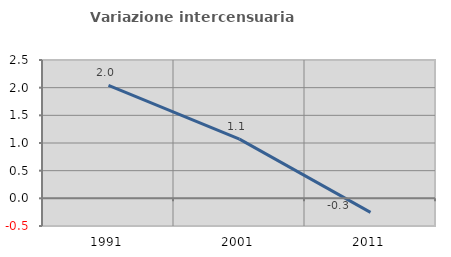
| Category | Variazione intercensuaria annua |
|---|---|
| 1991.0 | 2.042 |
| 2001.0 | 1.07 |
| 2011.0 | -0.254 |